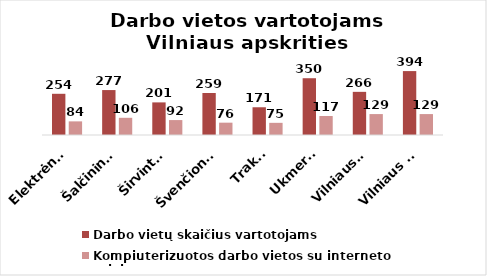
| Category | Darbo vietų skaičius vartotojams | Kompiuterizuotos darbo vietos su interneto prieiga |
|---|---|---|
| Elektrėnai | 254 | 84 |
| Šalčininkai | 277 | 106 |
| Širvintos | 201 | 92 |
| Švenčionys | 259 | 76 |
| Trakai | 171 | 75 |
| Ukmergė | 350 | 117 |
| Vilniaus r. | 266 | 129 |
| Vilniaus m. | 394 | 129 |